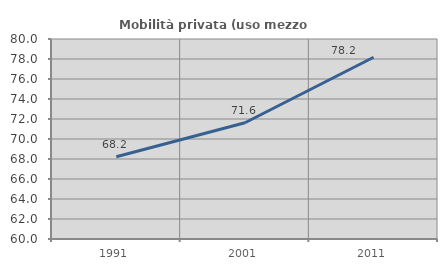
| Category | Mobilità privata (uso mezzo privato) |
|---|---|
| 1991.0 | 68.232 |
| 2001.0 | 71.627 |
| 2011.0 | 78.171 |